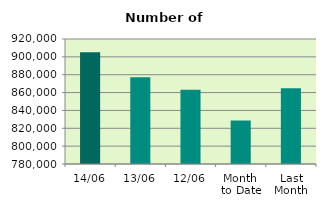
| Category | Series 0 |
|---|---|
| 14/06 | 905084 |
| 13/06 | 877262 |
| 12/06 | 863156 |
| Month 
to Date | 828699.8 |
| Last
Month | 864947.182 |